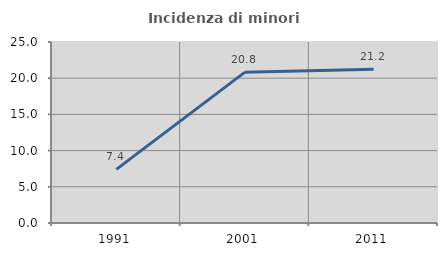
| Category | Incidenza di minori stranieri |
|---|---|
| 1991.0 | 7.407 |
| 2001.0 | 20.833 |
| 2011.0 | 21.245 |